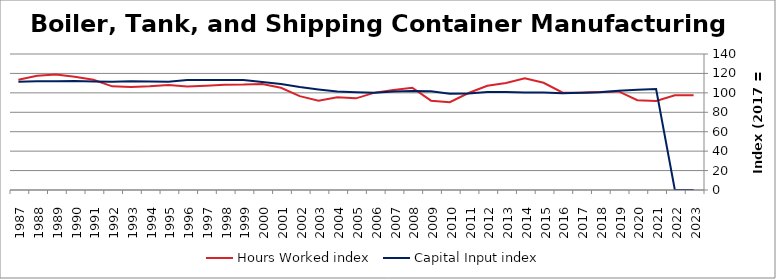
| Category | Hours Worked index | Capital Input index |
|---|---|---|
| 2023.0 | 97.499 | 0 |
| 2022.0 | 97.411 | 0 |
| 2021.0 | 91.623 | 103.892 |
| 2020.0 | 92.39 | 103.315 |
| 2019.0 | 101.467 | 102.08 |
| 2018.0 | 101.005 | 100.615 |
| 2017.0 | 100 | 100 |
| 2016.0 | 100.398 | 99.697 |
| 2015.0 | 110.352 | 100.308 |
| 2014.0 | 115.057 | 100.336 |
| 2013.0 | 110.075 | 100.779 |
| 2012.0 | 107.343 | 100.873 |
| 2011.0 | 99.866 | 99.441 |
| 2010.0 | 90.417 | 99.102 |
| 2009.0 | 91.949 | 101.675 |
| 2008.0 | 105.225 | 101.897 |
| 2007.0 | 103.03 | 101.314 |
| 2006.0 | 100.251 | 100.134 |
| 2005.0 | 94.342 | 100.582 |
| 2004.0 | 95.5 | 101.278 |
| 2003.0 | 91.962 | 103.509 |
| 2002.0 | 96.594 | 105.986 |
| 2001.0 | 105.261 | 109.183 |
| 2000.0 | 109.179 | 111.299 |
| 1999.0 | 108.566 | 113.193 |
| 1998.0 | 108.468 | 113.226 |
| 1997.0 | 107.426 | 113.174 |
| 1996.0 | 106.614 | 113.228 |
| 1995.0 | 108.198 | 111.509 |
| 1994.0 | 106.735 | 111.793 |
| 1993.0 | 105.992 | 111.957 |
| 1992.0 | 106.711 | 111.363 |
| 1991.0 | 113.403 | 111.7 |
| 1990.0 | 116.567 | 112.177 |
| 1989.0 | 118.929 | 112.051 |
| 1988.0 | 117.6 | 111.909 |
| 1987.0 | 113.437 | 111.484 |